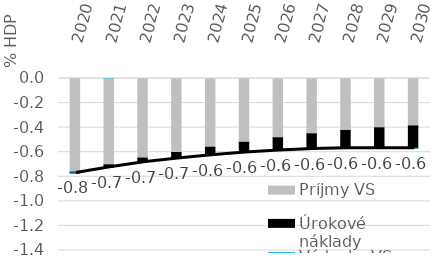
| Category | Príjmy VS | Úrokové náklady | Výdavky VS |
|---|---|---|---|
| 2020.0 | -0.762 | -0.006 | 0 |
| 2021.0 | -0.703 | -0.02 | 0 |
| 2022.0 | -0.648 | -0.033 | 0 |
| 2023.0 | -0.603 | -0.048 | 0 |
| 2024.0 | -0.56 | -0.065 | 0 |
| 2025.0 | -0.52 | -0.083 | 0 |
| 2026.0 | -0.483 | -0.103 | 0 |
| 2027.0 | -0.45 | -0.124 | 0 |
| 2028.0 | -0.423 | -0.145 | 0 |
| 2029.0 | -0.402 | -0.165 | 0 |
| 2030.0 | -0.386 | -0.18 | 0 |